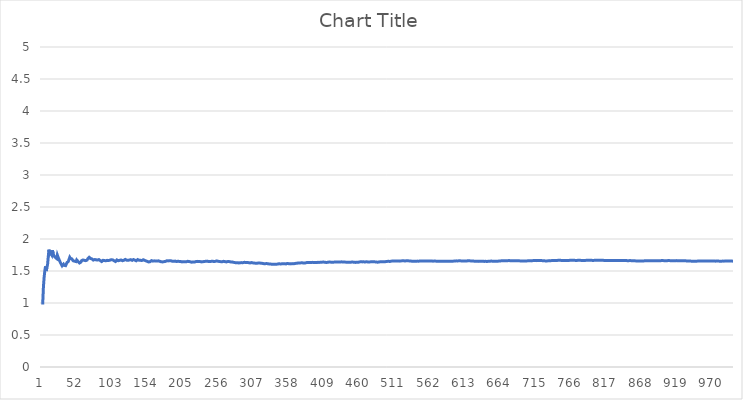
| Category | Series 0 |
|---|---|
| 0 | 1 |
| 1 | 1 |
| 2 | 1 |
| 3 | 1.25 |
| 4 | 1.4 |
| 5 | 1.5 |
| 6 | 1.571 |
| 7 | 1.5 |
| 8 | 1.556 |
| 9 | 1.6 |
| 10 | 1.727 |
| 11 | 1.833 |
| 12 | 1.769 |
| 13 | 1.786 |
| 14 | 1.8 |
| 15 | 1.75 |
| 16 | 1.824 |
| 17 | 1.778 |
| 18 | 1.737 |
| 19 | 1.75 |
| 20 | 1.714 |
| 21 | 1.727 |
| 22 | 1.696 |
| 23 | 1.75 |
| 24 | 1.72 |
| 25 | 1.692 |
| 26 | 1.667 |
| 27 | 1.643 |
| 28 | 1.621 |
| 29 | 1.6 |
| 30 | 1.581 |
| 31 | 1.594 |
| 32 | 1.606 |
| 33 | 1.588 |
| 34 | 1.6 |
| 35 | 1.583 |
| 36 | 1.595 |
| 37 | 1.632 |
| 38 | 1.641 |
| 39 | 1.65 |
| 40 | 1.683 |
| 41 | 1.714 |
| 42 | 1.698 |
| 43 | 1.705 |
| 44 | 1.689 |
| 45 | 1.674 |
| 46 | 1.66 |
| 47 | 1.667 |
| 48 | 1.653 |
| 49 | 1.66 |
| 50 | 1.647 |
| 51 | 1.673 |
| 52 | 1.66 |
| 53 | 1.648 |
| 54 | 1.636 |
| 55 | 1.625 |
| 56 | 1.614 |
| 57 | 1.638 |
| 58 | 1.661 |
| 59 | 1.65 |
| 60 | 1.672 |
| 61 | 1.677 |
| 62 | 1.667 |
| 63 | 1.672 |
| 64 | 1.662 |
| 65 | 1.667 |
| 66 | 1.672 |
| 67 | 1.691 |
| 68 | 1.696 |
| 69 | 1.714 |
| 70 | 1.704 |
| 71 | 1.694 |
| 72 | 1.699 |
| 73 | 1.689 |
| 74 | 1.68 |
| 75 | 1.671 |
| 76 | 1.662 |
| 77 | 1.679 |
| 78 | 1.684 |
| 79 | 1.675 |
| 80 | 1.667 |
| 81 | 1.671 |
| 82 | 1.663 |
| 83 | 1.679 |
| 84 | 1.671 |
| 85 | 1.663 |
| 86 | 1.655 |
| 87 | 1.648 |
| 88 | 1.652 |
| 89 | 1.667 |
| 90 | 1.659 |
| 91 | 1.663 |
| 92 | 1.667 |
| 93 | 1.66 |
| 94 | 1.674 |
| 95 | 1.667 |
| 96 | 1.67 |
| 97 | 1.663 |
| 98 | 1.667 |
| 99 | 1.67 |
| 100 | 1.663 |
| 101 | 1.676 |
| 102 | 1.68 |
| 103 | 1.673 |
| 104 | 1.667 |
| 105 | 1.66 |
| 106 | 1.654 |
| 107 | 1.648 |
| 108 | 1.661 |
| 109 | 1.673 |
| 110 | 1.667 |
| 111 | 1.661 |
| 112 | 1.655 |
| 113 | 1.667 |
| 114 | 1.67 |
| 115 | 1.672 |
| 116 | 1.667 |
| 117 | 1.661 |
| 118 | 1.664 |
| 119 | 1.667 |
| 120 | 1.669 |
| 121 | 1.68 |
| 122 | 1.675 |
| 123 | 1.669 |
| 124 | 1.672 |
| 125 | 1.667 |
| 126 | 1.669 |
| 127 | 1.672 |
| 128 | 1.667 |
| 129 | 1.677 |
| 130 | 1.672 |
| 131 | 1.667 |
| 132 | 1.677 |
| 133 | 1.679 |
| 134 | 1.674 |
| 135 | 1.669 |
| 136 | 1.664 |
| 137 | 1.659 |
| 138 | 1.669 |
| 139 | 1.679 |
| 140 | 1.674 |
| 141 | 1.669 |
| 142 | 1.664 |
| 143 | 1.667 |
| 144 | 1.662 |
| 145 | 1.664 |
| 146 | 1.667 |
| 147 | 1.676 |
| 148 | 1.671 |
| 149 | 1.667 |
| 150 | 1.662 |
| 151 | 1.658 |
| 152 | 1.654 |
| 153 | 1.649 |
| 154 | 1.645 |
| 155 | 1.641 |
| 156 | 1.643 |
| 157 | 1.646 |
| 158 | 1.654 |
| 159 | 1.662 |
| 160 | 1.658 |
| 161 | 1.654 |
| 162 | 1.656 |
| 163 | 1.659 |
| 164 | 1.661 |
| 165 | 1.657 |
| 166 | 1.659 |
| 167 | 1.655 |
| 168 | 1.651 |
| 169 | 1.659 |
| 170 | 1.655 |
| 171 | 1.651 |
| 172 | 1.647 |
| 173 | 1.644 |
| 174 | 1.64 |
| 175 | 1.642 |
| 176 | 1.65 |
| 177 | 1.646 |
| 178 | 1.648 |
| 179 | 1.65 |
| 180 | 1.657 |
| 181 | 1.659 |
| 182 | 1.661 |
| 183 | 1.658 |
| 184 | 1.665 |
| 185 | 1.661 |
| 186 | 1.663 |
| 187 | 1.66 |
| 188 | 1.656 |
| 189 | 1.653 |
| 190 | 1.654 |
| 191 | 1.651 |
| 192 | 1.648 |
| 193 | 1.655 |
| 194 | 1.651 |
| 195 | 1.648 |
| 196 | 1.655 |
| 197 | 1.652 |
| 198 | 1.653 |
| 199 | 1.65 |
| 200 | 1.652 |
| 201 | 1.649 |
| 202 | 1.645 |
| 203 | 1.642 |
| 204 | 1.649 |
| 205 | 1.646 |
| 206 | 1.643 |
| 207 | 1.644 |
| 208 | 1.646 |
| 209 | 1.643 |
| 210 | 1.645 |
| 211 | 1.651 |
| 212 | 1.653 |
| 213 | 1.65 |
| 214 | 1.647 |
| 215 | 1.644 |
| 216 | 1.641 |
| 217 | 1.638 |
| 218 | 1.635 |
| 219 | 1.641 |
| 220 | 1.643 |
| 221 | 1.64 |
| 222 | 1.641 |
| 223 | 1.647 |
| 224 | 1.653 |
| 225 | 1.65 |
| 226 | 1.648 |
| 227 | 1.649 |
| 228 | 1.646 |
| 229 | 1.648 |
| 230 | 1.645 |
| 231 | 1.642 |
| 232 | 1.644 |
| 233 | 1.645 |
| 234 | 1.651 |
| 235 | 1.648 |
| 236 | 1.654 |
| 237 | 1.651 |
| 238 | 1.657 |
| 239 | 1.654 |
| 240 | 1.651 |
| 241 | 1.649 |
| 242 | 1.65 |
| 243 | 1.648 |
| 244 | 1.653 |
| 245 | 1.65 |
| 246 | 1.652 |
| 247 | 1.653 |
| 248 | 1.651 |
| 249 | 1.648 |
| 250 | 1.649 |
| 251 | 1.651 |
| 252 | 1.652 |
| 253 | 1.657 |
| 254 | 1.655 |
| 255 | 1.652 |
| 256 | 1.65 |
| 257 | 1.647 |
| 258 | 1.649 |
| 259 | 1.646 |
| 260 | 1.648 |
| 261 | 1.645 |
| 262 | 1.646 |
| 263 | 1.652 |
| 264 | 1.649 |
| 265 | 1.647 |
| 266 | 1.644 |
| 267 | 1.642 |
| 268 | 1.643 |
| 269 | 1.648 |
| 270 | 1.646 |
| 271 | 1.647 |
| 272 | 1.645 |
| 273 | 1.642 |
| 274 | 1.644 |
| 275 | 1.641 |
| 276 | 1.639 |
| 277 | 1.637 |
| 278 | 1.634 |
| 279 | 1.632 |
| 280 | 1.63 |
| 281 | 1.628 |
| 282 | 1.629 |
| 283 | 1.63 |
| 284 | 1.628 |
| 285 | 1.626 |
| 286 | 1.624 |
| 287 | 1.628 |
| 288 | 1.626 |
| 289 | 1.631 |
| 290 | 1.632 |
| 291 | 1.63 |
| 292 | 1.635 |
| 293 | 1.636 |
| 294 | 1.634 |
| 295 | 1.632 |
| 296 | 1.633 |
| 297 | 1.634 |
| 298 | 1.632 |
| 299 | 1.63 |
| 300 | 1.628 |
| 301 | 1.626 |
| 302 | 1.627 |
| 303 | 1.632 |
| 304 | 1.63 |
| 305 | 1.627 |
| 306 | 1.625 |
| 307 | 1.623 |
| 308 | 1.621 |
| 309 | 1.623 |
| 310 | 1.624 |
| 311 | 1.622 |
| 312 | 1.62 |
| 313 | 1.624 |
| 314 | 1.622 |
| 315 | 1.623 |
| 316 | 1.625 |
| 317 | 1.623 |
| 318 | 1.621 |
| 319 | 1.619 |
| 320 | 1.617 |
| 321 | 1.615 |
| 322 | 1.613 |
| 323 | 1.614 |
| 324 | 1.612 |
| 325 | 1.617 |
| 326 | 1.615 |
| 327 | 1.613 |
| 328 | 1.611 |
| 329 | 1.609 |
| 330 | 1.607 |
| 331 | 1.608 |
| 332 | 1.607 |
| 333 | 1.605 |
| 334 | 1.606 |
| 335 | 1.604 |
| 336 | 1.605 |
| 337 | 1.604 |
| 338 | 1.605 |
| 339 | 1.606 |
| 340 | 1.61 |
| 341 | 1.608 |
| 342 | 1.609 |
| 343 | 1.613 |
| 344 | 1.612 |
| 345 | 1.61 |
| 346 | 1.614 |
| 347 | 1.612 |
| 348 | 1.613 |
| 349 | 1.611 |
| 350 | 1.613 |
| 351 | 1.614 |
| 352 | 1.612 |
| 353 | 1.61 |
| 354 | 1.614 |
| 355 | 1.618 |
| 356 | 1.616 |
| 357 | 1.615 |
| 358 | 1.613 |
| 359 | 1.611 |
| 360 | 1.609 |
| 361 | 1.613 |
| 362 | 1.614 |
| 363 | 1.615 |
| 364 | 1.616 |
| 365 | 1.615 |
| 366 | 1.616 |
| 367 | 1.62 |
| 368 | 1.623 |
| 369 | 1.622 |
| 370 | 1.623 |
| 371 | 1.626 |
| 372 | 1.625 |
| 373 | 1.626 |
| 374 | 1.629 |
| 375 | 1.628 |
| 376 | 1.626 |
| 377 | 1.627 |
| 378 | 1.625 |
| 379 | 1.624 |
| 380 | 1.625 |
| 381 | 1.626 |
| 382 | 1.629 |
| 383 | 1.633 |
| 384 | 1.634 |
| 385 | 1.632 |
| 386 | 1.633 |
| 387 | 1.634 |
| 388 | 1.632 |
| 389 | 1.633 |
| 390 | 1.634 |
| 391 | 1.635 |
| 392 | 1.634 |
| 393 | 1.632 |
| 394 | 1.633 |
| 395 | 1.634 |
| 396 | 1.632 |
| 397 | 1.633 |
| 398 | 1.634 |
| 399 | 1.635 |
| 400 | 1.636 |
| 401 | 1.634 |
| 402 | 1.638 |
| 403 | 1.636 |
| 404 | 1.64 |
| 405 | 1.638 |
| 406 | 1.636 |
| 407 | 1.64 |
| 408 | 1.638 |
| 409 | 1.637 |
| 410 | 1.635 |
| 411 | 1.633 |
| 412 | 1.634 |
| 413 | 1.635 |
| 414 | 1.636 |
| 415 | 1.639 |
| 416 | 1.64 |
| 417 | 1.639 |
| 418 | 1.637 |
| 419 | 1.638 |
| 420 | 1.637 |
| 421 | 1.637 |
| 422 | 1.638 |
| 423 | 1.639 |
| 424 | 1.64 |
| 425 | 1.641 |
| 426 | 1.639 |
| 427 | 1.64 |
| 428 | 1.641 |
| 429 | 1.642 |
| 430 | 1.64 |
| 431 | 1.639 |
| 432 | 1.64 |
| 433 | 1.643 |
| 434 | 1.641 |
| 435 | 1.642 |
| 436 | 1.641 |
| 437 | 1.639 |
| 438 | 1.638 |
| 439 | 1.639 |
| 440 | 1.637 |
| 441 | 1.638 |
| 442 | 1.637 |
| 443 | 1.637 |
| 444 | 1.638 |
| 445 | 1.637 |
| 446 | 1.638 |
| 447 | 1.638 |
| 448 | 1.637 |
| 449 | 1.64 |
| 450 | 1.639 |
| 451 | 1.637 |
| 452 | 1.636 |
| 453 | 1.634 |
| 454 | 1.637 |
| 455 | 1.636 |
| 456 | 1.637 |
| 457 | 1.635 |
| 458 | 1.638 |
| 459 | 1.641 |
| 460 | 1.642 |
| 461 | 1.645 |
| 462 | 1.644 |
| 463 | 1.642 |
| 464 | 1.641 |
| 465 | 1.644 |
| 466 | 1.642 |
| 467 | 1.641 |
| 468 | 1.644 |
| 469 | 1.645 |
| 470 | 1.643 |
| 471 | 1.642 |
| 472 | 1.643 |
| 473 | 1.641 |
| 474 | 1.64 |
| 475 | 1.643 |
| 476 | 1.644 |
| 477 | 1.644 |
| 478 | 1.645 |
| 479 | 1.644 |
| 480 | 1.644 |
| 481 | 1.643 |
| 482 | 1.642 |
| 483 | 1.64 |
| 484 | 1.639 |
| 485 | 1.638 |
| 486 | 1.641 |
| 487 | 1.639 |
| 488 | 1.642 |
| 489 | 1.645 |
| 490 | 1.644 |
| 491 | 1.646 |
| 492 | 1.647 |
| 493 | 1.646 |
| 494 | 1.644 |
| 495 | 1.645 |
| 496 | 1.646 |
| 497 | 1.647 |
| 498 | 1.647 |
| 499 | 1.65 |
| 500 | 1.651 |
| 501 | 1.651 |
| 502 | 1.65 |
| 503 | 1.649 |
| 504 | 1.651 |
| 505 | 1.654 |
| 506 | 1.655 |
| 507 | 1.656 |
| 508 | 1.658 |
| 509 | 1.657 |
| 510 | 1.658 |
| 511 | 1.656 |
| 512 | 1.657 |
| 513 | 1.656 |
| 514 | 1.656 |
| 515 | 1.657 |
| 516 | 1.656 |
| 517 | 1.654 |
| 518 | 1.655 |
| 519 | 1.658 |
| 520 | 1.656 |
| 521 | 1.659 |
| 522 | 1.66 |
| 523 | 1.658 |
| 524 | 1.657 |
| 525 | 1.658 |
| 526 | 1.657 |
| 527 | 1.659 |
| 528 | 1.66 |
| 529 | 1.658 |
| 530 | 1.659 |
| 531 | 1.658 |
| 532 | 1.657 |
| 533 | 1.655 |
| 534 | 1.654 |
| 535 | 1.653 |
| 536 | 1.652 |
| 537 | 1.652 |
| 538 | 1.651 |
| 539 | 1.652 |
| 540 | 1.652 |
| 541 | 1.653 |
| 542 | 1.652 |
| 543 | 1.654 |
| 544 | 1.655 |
| 545 | 1.654 |
| 546 | 1.656 |
| 547 | 1.657 |
| 548 | 1.656 |
| 549 | 1.656 |
| 550 | 1.657 |
| 551 | 1.656 |
| 552 | 1.656 |
| 553 | 1.655 |
| 554 | 1.656 |
| 555 | 1.656 |
| 556 | 1.659 |
| 557 | 1.658 |
| 558 | 1.657 |
| 559 | 1.655 |
| 560 | 1.656 |
| 561 | 1.655 |
| 562 | 1.654 |
| 563 | 1.656 |
| 564 | 1.655 |
| 565 | 1.654 |
| 566 | 1.656 |
| 567 | 1.655 |
| 568 | 1.654 |
| 569 | 1.654 |
| 570 | 1.653 |
| 571 | 1.652 |
| 572 | 1.653 |
| 573 | 1.652 |
| 574 | 1.65 |
| 575 | 1.651 |
| 576 | 1.652 |
| 577 | 1.651 |
| 578 | 1.651 |
| 579 | 1.652 |
| 580 | 1.652 |
| 581 | 1.651 |
| 582 | 1.654 |
| 583 | 1.652 |
| 584 | 1.653 |
| 585 | 1.652 |
| 586 | 1.652 |
| 587 | 1.651 |
| 588 | 1.652 |
| 589 | 1.653 |
| 590 | 1.653 |
| 591 | 1.654 |
| 592 | 1.653 |
| 593 | 1.653 |
| 594 | 1.654 |
| 595 | 1.654 |
| 596 | 1.657 |
| 597 | 1.656 |
| 598 | 1.658 |
| 599 | 1.658 |
| 600 | 1.659 |
| 601 | 1.658 |
| 602 | 1.658 |
| 603 | 1.659 |
| 604 | 1.658 |
| 605 | 1.658 |
| 606 | 1.657 |
| 607 | 1.656 |
| 608 | 1.657 |
| 609 | 1.657 |
| 610 | 1.658 |
| 611 | 1.657 |
| 612 | 1.656 |
| 613 | 1.655 |
| 614 | 1.657 |
| 615 | 1.659 |
| 616 | 1.661 |
| 617 | 1.66 |
| 618 | 1.659 |
| 619 | 1.658 |
| 620 | 1.659 |
| 621 | 1.658 |
| 622 | 1.657 |
| 623 | 1.655 |
| 624 | 1.654 |
| 625 | 1.653 |
| 626 | 1.652 |
| 627 | 1.651 |
| 628 | 1.65 |
| 629 | 1.651 |
| 630 | 1.651 |
| 631 | 1.65 |
| 632 | 1.651 |
| 633 | 1.653 |
| 634 | 1.652 |
| 635 | 1.651 |
| 636 | 1.653 |
| 637 | 1.652 |
| 638 | 1.651 |
| 639 | 1.65 |
| 640 | 1.651 |
| 641 | 1.651 |
| 642 | 1.65 |
| 643 | 1.649 |
| 644 | 1.65 |
| 645 | 1.652 |
| 646 | 1.652 |
| 647 | 1.651 |
| 648 | 1.653 |
| 649 | 1.655 |
| 650 | 1.654 |
| 651 | 1.653 |
| 652 | 1.652 |
| 653 | 1.653 |
| 654 | 1.652 |
| 655 | 1.651 |
| 656 | 1.651 |
| 657 | 1.65 |
| 658 | 1.653 |
| 659 | 1.653 |
| 660 | 1.655 |
| 661 | 1.657 |
| 662 | 1.658 |
| 663 | 1.658 |
| 664 | 1.657 |
| 665 | 1.659 |
| 666 | 1.661 |
| 667 | 1.66 |
| 668 | 1.659 |
| 669 | 1.66 |
| 670 | 1.659 |
| 671 | 1.659 |
| 672 | 1.661 |
| 673 | 1.662 |
| 674 | 1.662 |
| 675 | 1.663 |
| 676 | 1.662 |
| 677 | 1.661 |
| 678 | 1.66 |
| 679 | 1.659 |
| 680 | 1.658 |
| 681 | 1.66 |
| 682 | 1.662 |
| 683 | 1.661 |
| 684 | 1.66 |
| 685 | 1.659 |
| 686 | 1.661 |
| 687 | 1.66 |
| 688 | 1.659 |
| 689 | 1.659 |
| 690 | 1.658 |
| 691 | 1.658 |
| 692 | 1.657 |
| 693 | 1.656 |
| 694 | 1.656 |
| 695 | 1.657 |
| 696 | 1.659 |
| 697 | 1.658 |
| 698 | 1.657 |
| 699 | 1.657 |
| 700 | 1.658 |
| 701 | 1.658 |
| 702 | 1.659 |
| 703 | 1.659 |
| 704 | 1.661 |
| 705 | 1.66 |
| 706 | 1.659 |
| 707 | 1.658 |
| 708 | 1.66 |
| 709 | 1.662 |
| 710 | 1.664 |
| 711 | 1.664 |
| 712 | 1.665 |
| 713 | 1.664 |
| 714 | 1.663 |
| 715 | 1.662 |
| 716 | 1.664 |
| 717 | 1.663 |
| 718 | 1.663 |
| 719 | 1.664 |
| 720 | 1.664 |
| 721 | 1.663 |
| 722 | 1.663 |
| 723 | 1.662 |
| 724 | 1.661 |
| 725 | 1.66 |
| 726 | 1.659 |
| 727 | 1.658 |
| 728 | 1.657 |
| 729 | 1.658 |
| 730 | 1.658 |
| 731 | 1.658 |
| 732 | 1.66 |
| 733 | 1.662 |
| 734 | 1.663 |
| 735 | 1.662 |
| 736 | 1.661 |
| 737 | 1.663 |
| 738 | 1.664 |
| 739 | 1.664 |
| 740 | 1.663 |
| 741 | 1.664 |
| 742 | 1.664 |
| 743 | 1.663 |
| 744 | 1.664 |
| 745 | 1.666 |
| 746 | 1.667 |
| 747 | 1.667 |
| 748 | 1.666 |
| 749 | 1.667 |
| 750 | 1.666 |
| 751 | 1.665 |
| 752 | 1.664 |
| 753 | 1.664 |
| 754 | 1.664 |
| 755 | 1.663 |
| 756 | 1.663 |
| 757 | 1.664 |
| 758 | 1.664 |
| 759 | 1.663 |
| 760 | 1.665 |
| 761 | 1.664 |
| 762 | 1.666 |
| 763 | 1.668 |
| 764 | 1.667 |
| 765 | 1.667 |
| 766 | 1.669 |
| 767 | 1.668 |
| 768 | 1.667 |
| 769 | 1.666 |
| 770 | 1.665 |
| 771 | 1.666 |
| 772 | 1.666 |
| 773 | 1.665 |
| 774 | 1.667 |
| 775 | 1.668 |
| 776 | 1.667 |
| 777 | 1.667 |
| 778 | 1.666 |
| 779 | 1.665 |
| 780 | 1.665 |
| 781 | 1.664 |
| 782 | 1.664 |
| 783 | 1.666 |
| 784 | 1.665 |
| 785 | 1.665 |
| 786 | 1.666 |
| 787 | 1.668 |
| 788 | 1.668 |
| 789 | 1.668 |
| 790 | 1.668 |
| 791 | 1.668 |
| 792 | 1.668 |
| 793 | 1.668 |
| 794 | 1.667 |
| 795 | 1.666 |
| 796 | 1.666 |
| 797 | 1.665 |
| 798 | 1.667 |
| 799 | 1.667 |
| 800 | 1.667 |
| 801 | 1.667 |
| 802 | 1.666 |
| 803 | 1.667 |
| 804 | 1.666 |
| 805 | 1.667 |
| 806 | 1.667 |
| 807 | 1.667 |
| 808 | 1.667 |
| 809 | 1.667 |
| 810 | 1.666 |
| 811 | 1.666 |
| 812 | 1.665 |
| 813 | 1.665 |
| 814 | 1.665 |
| 815 | 1.664 |
| 816 | 1.665 |
| 817 | 1.665 |
| 818 | 1.665 |
| 819 | 1.665 |
| 820 | 1.664 |
| 821 | 1.663 |
| 822 | 1.665 |
| 823 | 1.664 |
| 824 | 1.663 |
| 825 | 1.662 |
| 826 | 1.663 |
| 827 | 1.663 |
| 828 | 1.663 |
| 829 | 1.663 |
| 830 | 1.664 |
| 831 | 1.666 |
| 832 | 1.665 |
| 833 | 1.664 |
| 834 | 1.663 |
| 835 | 1.663 |
| 836 | 1.664 |
| 837 | 1.665 |
| 838 | 1.664 |
| 839 | 1.663 |
| 840 | 1.662 |
| 841 | 1.663 |
| 842 | 1.662 |
| 843 | 1.664 |
| 844 | 1.663 |
| 845 | 1.662 |
| 846 | 1.661 |
| 847 | 1.662 |
| 848 | 1.661 |
| 849 | 1.662 |
| 850 | 1.662 |
| 851 | 1.662 |
| 852 | 1.661 |
| 853 | 1.66 |
| 854 | 1.66 |
| 855 | 1.659 |
| 856 | 1.659 |
| 857 | 1.659 |
| 858 | 1.658 |
| 859 | 1.657 |
| 860 | 1.656 |
| 861 | 1.657 |
| 862 | 1.656 |
| 863 | 1.655 |
| 864 | 1.654 |
| 865 | 1.655 |
| 866 | 1.655 |
| 867 | 1.657 |
| 868 | 1.658 |
| 869 | 1.657 |
| 870 | 1.659 |
| 871 | 1.659 |
| 872 | 1.659 |
| 873 | 1.66 |
| 874 | 1.661 |
| 875 | 1.661 |
| 876 | 1.66 |
| 877 | 1.661 |
| 878 | 1.66 |
| 879 | 1.661 |
| 880 | 1.661 |
| 881 | 1.66 |
| 882 | 1.66 |
| 883 | 1.661 |
| 884 | 1.661 |
| 885 | 1.66 |
| 886 | 1.66 |
| 887 | 1.66 |
| 888 | 1.66 |
| 889 | 1.661 |
| 890 | 1.662 |
| 891 | 1.661 |
| 892 | 1.661 |
| 893 | 1.66 |
| 894 | 1.661 |
| 895 | 1.663 |
| 896 | 1.662 |
| 897 | 1.663 |
| 898 | 1.662 |
| 899 | 1.661 |
| 900 | 1.66 |
| 901 | 1.661 |
| 902 | 1.66 |
| 903 | 1.662 |
| 904 | 1.662 |
| 905 | 1.663 |
| 906 | 1.663 |
| 907 | 1.662 |
| 908 | 1.661 |
| 909 | 1.662 |
| 910 | 1.662 |
| 911 | 1.661 |
| 912 | 1.66 |
| 913 | 1.661 |
| 914 | 1.66 |
| 915 | 1.66 |
| 916 | 1.661 |
| 917 | 1.662 |
| 918 | 1.662 |
| 919 | 1.661 |
| 920 | 1.66 |
| 921 | 1.659 |
| 922 | 1.66 |
| 923 | 1.659 |
| 924 | 1.661 |
| 925 | 1.661 |
| 926 | 1.66 |
| 927 | 1.661 |
| 928 | 1.66 |
| 929 | 1.659 |
| 930 | 1.658 |
| 931 | 1.658 |
| 932 | 1.657 |
| 933 | 1.656 |
| 934 | 1.657 |
| 935 | 1.656 |
| 936 | 1.655 |
| 937 | 1.655 |
| 938 | 1.654 |
| 939 | 1.653 |
| 940 | 1.654 |
| 941 | 1.653 |
| 942 | 1.653 |
| 943 | 1.653 |
| 944 | 1.652 |
| 945 | 1.652 |
| 946 | 1.654 |
| 947 | 1.655 |
| 948 | 1.654 |
| 949 | 1.655 |
| 950 | 1.655 |
| 951 | 1.657 |
| 952 | 1.656 |
| 953 | 1.655 |
| 954 | 1.655 |
| 955 | 1.656 |
| 956 | 1.656 |
| 957 | 1.656 |
| 958 | 1.656 |
| 959 | 1.657 |
| 960 | 1.658 |
| 961 | 1.658 |
| 962 | 1.658 |
| 963 | 1.658 |
| 964 | 1.657 |
| 965 | 1.656 |
| 966 | 1.656 |
| 967 | 1.655 |
| 968 | 1.654 |
| 969 | 1.656 |
| 970 | 1.655 |
| 971 | 1.655 |
| 972 | 1.655 |
| 973 | 1.654 |
| 974 | 1.655 |
| 975 | 1.656 |
| 976 | 1.655 |
| 977 | 1.654 |
| 978 | 1.654 |
| 979 | 1.654 |
| 980 | 1.654 |
| 981 | 1.654 |
| 982 | 1.655 |
| 983 | 1.654 |
| 984 | 1.654 |
| 985 | 1.654 |
| 986 | 1.656 |
| 987 | 1.655 |
| 988 | 1.655 |
| 989 | 1.656 |
| 990 | 1.656 |
| 991 | 1.655 |
| 992 | 1.656 |
| 993 | 1.656 |
| 994 | 1.656 |
| 995 | 1.656 |
| 996 | 1.655 |
| 997 | 1.654 |
| 998 | 1.654 |
| 999 | 1.654 |